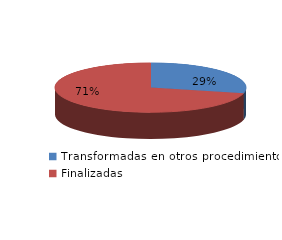
| Category | Series 0 |
|---|---|
| Transformadas en otros procedimientos | 5558 |
| Finalizadas | 13826 |